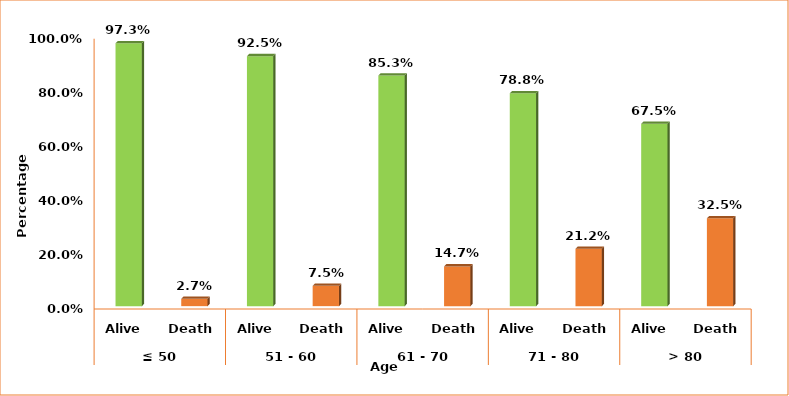
| Category | Series 0 |
|---|---|
| 0 | 0.973 |
| 1 | 0.027 |
| 2 | 0.925 |
| 3 | 0.075 |
| 4 | 0.853 |
| 5 | 0.147 |
| 6 | 0.788 |
| 7 | 0.212 |
| 8 | 0.675 |
| 9 | 0.325 |